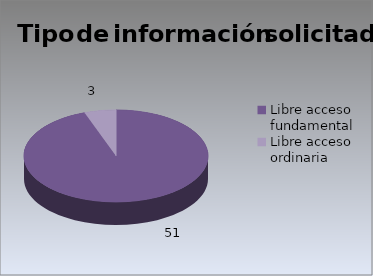
| Category | Series 0 |
|---|---|
| Libre acceso fundamental | 51 |
| Libre acceso ordinaria  | 3 |